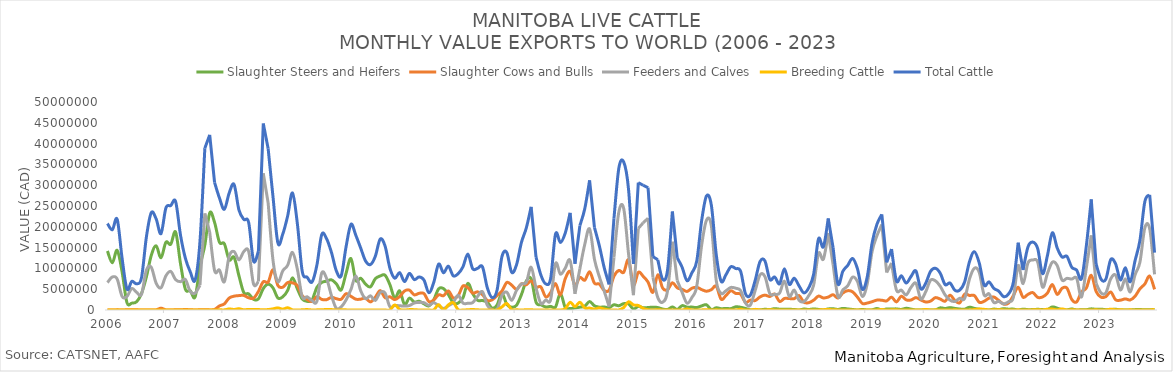
| Category | Slaughter Steers and Heifers | Slaughter Cows and Bulls | Feeders and Calves | Breeding Cattle | Total Cattle |
|---|---|---|---|---|---|
| 2006-01-01 | 14187904 | 5833 | 6591304 | 0 | 20785041 |
| 2006-02-01 | 11341319 | 11648 | 7928039 | 0 | 19281006 |
| 2006-03-01 | 14344812 | 31243 | 7440593 | 0 | 21816648 |
| 2006-04-01 | 9232013 | 18080 | 3279165 | 0 | 12529258 |
| 2006-05-01 | 1794050 | 38548 | 3237103 | 0 | 5069701 |
| 2006-06-01 | 1648332 | 71812 | 5171620 | 0 | 6891764 |
| 2006-07-01 | 1991443 | 43364 | 4253852 | 0 | 6288659 |
| 2006-08-01 | 3992152 | 0 | 3785370 | 0 | 7777522 |
| 2006-09-01 | 7959820 | 21344 | 9592922 | 0 | 17574086 |
| 2006-10-01 | 13127632 | 16458 | 10259279 | 0 | 23403369 |
| 2006-11-01 | 15422609 | 24030 | 6454480 | 0 | 21901119 |
| 2006-12-01 | 12555837 | 442847 | 5345739 | 0 | 18344423 |
| 2007-01-01 | 16281706 | 15391 | 8211393 | 0 | 24508490 |
| 2007-02-01 | 15818791 | 14749 | 9272261 | 0 | 25105801 |
| 2007-03-01 | 18738153 | 39614 | 7294564 | 0 | 26072331 |
| 2007-04-01 | 11161152 | 54176 | 6803755 | 0 | 18019083 |
| 2007-05-01 | 4994892 | 113471 | 7341133 | 0 | 12449496 |
| 2007-06-01 | 4651928 | 60521 | 4475342 | 0 | 9187791 |
| 2007-07-01 | 3135763 | 14576 | 4052472 | 0 | 7202811 |
| 2007-08-01 | 10463968 | 46770 | 5958488 | 0 | 16469226 |
| 2007-09-01 | 15598744 | 89978 | 23212124 | 0 | 38900846 |
| 2007-10-01 | 23343316 | 28135 | 18720277 | 0 | 42091728 |
| 2007-11-01 | 21040201 | 130356 | 9483319 | 0 | 30653876 |
| 2007-12-01 | 16280273 | 985290 | 9595732 | 46023 | 26907318 |
| 2008-01-01 | 15932224 | 1470525 | 6777698 | 33445 | 24213892 |
| 2008-02-01 | 12060461 | 2881618 | 12940348 | 249206 | 28131633 |
| 2008-03-01 | 12678058 | 3323484 | 14044679 | 132714 | 30178935 |
| 2008-04-01 | 8239235 | 3462530 | 12052325 | 294857 | 24048947 |
| 2008-05-01 | 4186915 | 3501724 | 14048994 | 56269 | 21793902 |
| 2008-06-01 | 3886678 | 2929304 | 14069918 | 140988 | 21026888 |
| 2008-07-01 | 2559955 | 2826612 | 6241963 | 124155 | 11752685 |
| 2008-08-01 | 2687825 | 4470797 | 6869086 | 107911 | 14135619 |
| 2008-09-01 | 5149888 | 6795923 | 32851550 | 35083 | 44832444 |
| 2008-10-01 | 6213290 | 6713226 | 25743866 | 109326 | 38779708 |
| 2008-11-01 | 5310735 | 9673176 | 11897774 | 276900 | 27158585 |
| 2008-12-01 | 2876273 | 5896305 | 6812893 | 511510 | 16096981 |
| 2009-01-01 | 3164992 | 5475904 | 9411820 | 197925 | 18250641 |
| 2009-02-01 | 4694803 | 6600046 | 10746835 | 539772 | 22581456 |
| 2009-03-01 | 7731548 | 6522191 | 13842401 | 38125 | 28134265 |
| 2009-04-01 | 5067954 | 5867918 | 9776770 | 7915 | 20720557 |
| 2009-05-01 | 2644755 | 3434314 | 3144349 | 39892 | 9263310 |
| 2009-06-01 | 2083407 | 2512518 | 3179141 | 103917 | 7878983 |
| 2009-07-01 | 2386515 | 2044848 | 2276924 | 12557 | 6720844 |
| 2009-08-01 | 5429442 | 3207333 | 2073322 | 30633 | 10740730 |
| 2009-09-01 | 6627423 | 2552131 | 8898741 | 49341 | 18127636 |
| 2009-10-01 | 6922475 | 2485088 | 7579433 | 132796 | 17119792 |
| 2009-11-01 | 7250504 | 3047411 | 3431969 | 103129 | 13833013 |
| 2009-12-01 | 6298529 | 2716718 | 382006 | 7381 | 9404634 |
| 2010-01-01 | 4826857 | 2593859 | 779081 | 38246 | 8238043 |
| 2010-02-01 | 8830912 | 3926017 | 2431916 | 31465 | 15220310 |
| 2010-03-01 | 12368940 | 3287651 | 4940770 | 0 | 20597361 |
| 2010-04-01 | 7136323 | 2597240 | 8208898 | 13126 | 17955587 |
| 2010-05-01 | 7642450 | 2604035 | 4638542 | 10378 | 14895405 |
| 2010-06-01 | 6217335 | 2841387 | 2723749 | 2617 | 11785088 |
| 2010-07-01 | 5570762 | 1947099 | 3411744 | 0 | 10929605 |
| 2010-08-01 | 7523630 | 3059142 | 2303454 | 15673 | 12901899 |
| 2010-09-01 | 8173951 | 4664316 | 4205856 | 0 | 17044123 |
| 2010-10-01 | 8362797 | 2953517 | 4070458 | 3105 | 15389877 |
| 2010-11-01 | 6072511 | 3170828 | 781666 | 5976 | 10030981 |
| 2010-12-01 | 2811809 | 2490822 | 1096604 | 1236783 | 7636018 |
| 2011-01-01 | 4595242 | 3237427 | 1016720 | 133404 | 8982793 |
| 2011-02-01 | 1309523 | 4564083 | 952847 | 0 | 6826453 |
| 2011-03-01 | 2858451 | 4776678 | 1069838 | 97480 | 8802447 |
| 2011-04-01 | 1903779 | 3639944 | 1678331 | 84601 | 7306655 |
| 2011-05-01 | 2100171 | 4017330 | 1824146 | 5960 | 7947607 |
| 2011-06-01 | 1481477 | 3942235 | 1758460 | 0 | 7182172 |
| 2011-07-01 | 990104 | 2019297 | 1126246 | 6824 | 4142471 |
| 2011-08-01 | 2458787 | 2395786 | 1750711 | 31743 | 6637027 |
| 2011-09-01 | 5074498 | 3652677 | 1010702 | 1291379 | 11029256 |
| 2011-10-01 | 5148920 | 3431319 | 363305 | 0 | 8943544 |
| 2011-11-01 | 3711327 | 4590631 | 1019521 | 1216890 | 10538369 |
| 2011-12-01 | 1724821 | 2917931 | 1799140 | 1776383 | 8218275 |
| 2012-01-01 | 1655396 | 3420608 | 3550341 | 100413 | 8726758 |
| 2012-02-01 | 2952434 | 5772904 | 1660142 | 0 | 10385480 |
| 2012-03-01 | 6396400 | 5362421 | 1617240 | 62267 | 13438328 |
| 2012-04-01 | 3951535 | 4066094 | 1778019 | 115435 | 9911083 |
| 2012-05-01 | 2329784 | 4366583 | 3270806 | 39966 | 10007139 |
| 2012-06-01 | 2279917 | 3708486 | 4391694 | 0 | 10380097 |
| 2012-07-01 | 1859692 | 2292790 | 1156590 | 12977 | 5322049 |
| 2012-08-01 | 452657 | 2448136 | 83976 | 0 | 2984769 |
| 2012-09-01 | 1199275 | 3510483 | 70703 | 0 | 4780461 |
| 2012-10-01 | 4024601 | 4559393 | 3492668 | 745031 | 12821693 |
| 2012-11-01 | 1348416 | 6617060 | 4276794 | 1565345 | 13807615 |
| 2012-12-01 | 671091 | 5982648 | 2322444 | 82150 | 9058333 |
| 2013-01-01 | 1142797 | 4984926 | 4715988 | 50413 | 10894124 |
| 2013-02-01 | 3689936 | 6295369 | 6248138 | 0 | 16233443 |
| 2013-03-01 | 6958552 | 6057976 | 6633666 | 58496 | 19708690 |
| 2013-04-01 | 7479647 | 6986678 | 10284914 | 47893 | 24799132 |
| 2013-05-01 | 1891004 | 5512602 | 5310753 | 0 | 12714359 |
| 2013-06-01 | 1252186 | 5537755 | 1586091 | 22679 | 8398711 |
| 2013-07-01 | 725313 | 3148345 | 2398543 | 0 | 6272201 |
| 2013-08-01 | 874553 | 4199016 | 2482637 | 0 | 7556206 |
| 2013-09-01 | 722089 | 6350757 | 11162610 | 17079 | 18252535 |
| 2013-10-01 | 3979542 | 3630921 | 8621963 | 0 | 16232426 |
| 2013-11-01 | 600510 | 7524782 | 10065407 | 308575 | 18499274 |
| 2013-12-01 | 357307 | 9279548 | 11866661 | 1856383 | 23359899 |
| 2014-01-01 | 493539 | 5942038 | 3877969 | 803830 | 11117376 |
| 2014-02-01 | 682186 | 7839484 | 9896218 | 1868299 | 20286187 |
| 2014-03-01 | 897650 | 7147617 | 15741401 | 509939 | 24296607 |
| 2014-04-01 | 2037349 | 9182224 | 19492498 | 458722 | 31170793 |
| 2014-05-01 | 1000433 | 6440127 | 12175424 | 202478 | 19818462 |
| 2014-06-01 | 687659 | 6234156 | 8006312 | 503563 | 15431690 |
| 2014-07-01 | 720700 | 4693005 | 4539293 | 223275 | 10176273 |
| 2014-08-01 | 578302 | 4746717 | 814266 | 15807 | 6155092 |
| 2014-09-01 | 1254646 | 8111051 | 12623783 | 19381 | 22008861 |
| 2014-10-01 | 1024771 | 9515586 | 23537454 | 0 | 34077811 |
| 2014-11-01 | 1525832 | 9064757 | 24390636 | 596426 | 35577651 |
| 2014-12-01 | 1470098 | 12042779 | 13432839 | 1988911 | 28934627 |
| 2015-01-01 | 236901 | 6038143 | 3551208 | 1228451 | 11054703 |
| 2015-02-01 | 873294 | 9037177 | 19613742 | 1091975 | 30616188 |
| 2015-03-01 | 523419 | 8098251 | 20964680 | 387984 | 29974334 |
| 2015-04-01 | 589216 | 6703437 | 22059439 | 65676 | 29417768 |
| 2015-05-01 | 685783 | 4260767 | 7875331 | 6645 | 12828526 |
| 2015-06-01 | 591428 | 8444089 | 2984759 | 67011 | 12087287 |
| 2015-07-01 | 226439 | 5275911 | 1879538 | 6980 | 7388868 |
| 2015-08-01 | 115084 | 4858880 | 4592052 | 17850 | 9583866 |
| 2015-09-01 | 730582 | 6538549 | 16412230 | 0 | 23681361 |
| 2015-10-01 | 132010 | 5320261 | 7055671 | 21473 | 12529415 |
| 2015-11-01 | 1048706 | 4967963 | 4246971 | 0 | 10263640 |
| 2015-12-01 | 690256 | 4466461 | 1647512 | 233904 | 7038133 |
| 2016-01-01 | 704410 | 5222057 | 2991201 | 13904 | 8931572 |
| 2016-02-01 | 588978 | 5461892 | 5696999 | 12692 | 11760561 |
| 2016-03-01 | 988503 | 4907803 | 15514149 | 25525 | 21435980 |
| 2016-04-01 | 1246707 | 4511591 | 21584608 | 78085 | 27420991 |
| 2016-05-01 | 102204 | 4882765 | 20178611 | 0 | 25163580 |
| 2016-06-01 | 536221 | 5716882 | 7080115 | 34948 | 13368166 |
| 2016-07-01 | 310954 | 2600981 | 4000587 | 0 | 6912522 |
| 2016-08-01 | 379947 | 3478365 | 4626684 | 14553 | 8499549 |
| 2016-09-01 | 334597 | 4619309 | 5422194 | 13830 | 10389930 |
| 2016-10-01 | 762969 | 3975548 | 5234474 | 0 | 9972991 |
| 2016-11-01 | 657444 | 3805498 | 4693416 | 175592 | 9331950 |
| 2016-12-01 | 371492 | 1841875 | 1690905 | 0 | 3904272 |
| 2017-01-01 | 32089 | 2371524 | 1167972 | 0 | 3571585 |
| 2017-02-01 | 4578 | 2265276 | 4711927 | 152285 | 7134066 |
| 2017-03-01 | 20184 | 3159520 | 8448852 | 29519 | 11658075 |
| 2017-04-01 | 176695 | 3579864 | 8034267 | 6158 | 11796984 |
| 2017-05-01 | 98106 | 3246415 | 3938173 | 66931 | 7349625 |
| 2017-06-01 | 322665 | 3820371 | 3784254 | 26115 | 7953405 |
| 2017-07-01 | 195129 | 2053773 | 4052502 | 0 | 6301404 |
| 2017-08-01 | 168303 | 2768911 | 6938554 | 25867 | 9901635 |
| 2017-09-01 | 165026 | 2750890 | 3223282 | 20942 | 6160140 |
| 2017-10-01 | 122629 | 2719424 | 4783194 | 20920 | 7646167 |
| 2017-11-01 | 0 | 3468692 | 2344667 | 0 | 5813359 |
| 2017-12-01 | 228123 | 1876977 | 2011972 | 0 | 4117072 |
| 2018-01-01 | 120815 | 1754497 | 3478608 | 3418 | 5357338 |
| 2018-02-01 | 254665 | 2362605 | 5974673 | 0 | 8591943 |
| 2018-03-01 | 139189 | 3350299 | 13613402 | 20821 | 17123711 |
| 2018-04-01 | 0 | 2889450 | 12226197 | 77020 | 15192667 |
| 2018-05-01 | 258334 | 3114671 | 18511150 | 127877 | 22012032 |
| 2018-06-01 | 303890 | 3669305 | 10899619 | 50517 | 14923331 |
| 2018-07-01 | 131117 | 2864661 | 3232824 | 26196 | 6254798 |
| 2018-08-01 | 387656 | 4087441 | 4824182 | 12297 | 9311576 |
| 2018-09-01 | 253491 | 4648894 | 5823313 | 0 | 10725698 |
| 2018-10-01 | 128357 | 4367623 | 7899262 | 0 | 12395242 |
| 2018-11-01 | 0 | 3079002 | 6830582 | 0 | 9909584 |
| 2018-12-01 | 126180 | 1578768 | 3258035 | 0 | 4962983 |
| 2019-01-01 | 0 | 1668919 | 6276109 | 0 | 7945028 |
| 2019-02-01 | 34857 | 1997599 | 14074725 | 0 | 16107181 |
| 2019-03-01 | 353914 | 2375723 | 17858675 | 25466 | 20613778 |
| 2019-04-01 | 0 | 2345831 | 20541126 | 104201 | 22991158 |
| 2019-05-01 | 255039 | 2195536 | 9010124 | 0 | 11460699 |
| 2019-06-01 | 246509 | 3088066 | 11273309 | 40725 | 14648609 |
| 2019-07-01 | 266277 | 1943733 | 4780863 | 35504 | 7026377 |
| 2019-08-01 | 135914 | 3315748 | 4777255 | 0 | 8228917 |
| 2019-09-01 | 413412 | 2435981 | 3630258 | 6090 | 6485741 |
| 2019-10-01 | 211489 | 2399486 | 5453301 | 0 | 8064276 |
| 2019-11-01 | 0 | 2977493 | 6402249 | 0 | 9379742 |
| 2019-12-01 | 0 | 2412519 | 2684816 | 0 | 5097335 |
| 2020-01-01 | 0 | 1937299 | 4351129 | 125703 | 6414131 |
| 2020-02-01 | 3170 | 2126023 | 7148714 | 0 | 9277907 |
| 2020-03-01 | 10914 | 2967669 | 7010772 | 37813 | 10027168 |
| 2020-04-01 | 513762 | 2621610 | 5681261 | 12723 | 8829356 |
| 2020-05-01 | 364226 | 2120934 | 3611634 | 0 | 6096794 |
| 2020-06-01 | 573968 | 3552029 | 2368110 | 0 | 6494107 |
| 2020-07-01 | 374854 | 2280702 | 2047658 | 40631 | 4743845 |
| 2020-08-01 | 235577 | 1725007 | 2830180 | 0 | 4790764 |
| 2020-09-01 | 173724 | 3803919 | 2761601 | 0 | 6739244 |
| 2020-10-01 | 674990 | 3491895 | 7461132 | 0 | 11628017 |
| 2020-11-01 | 389233 | 3470278 | 10037358 | 113708 | 14010577 |
| 2020-12-01 | 163115 | 1851749 | 9051813 | 239867 | 11306544 |
| 2021-01-01 | 116075 | 2088327 | 3638229 | 157961 | 6000592 |
| 2021-02-01 | 0 | 2849875 | 3912863 | 0 | 6762738 |
| 2021-03-01 | 217255 | 3122711 | 1793345 | 70477 | 5203788 |
| 2021-04-01 | 107304 | 2300189 | 2078459 | 58860 | 4544812 |
| 2021-05-01 | 301866 | 1431621 | 1450431 | 27184 | 3211102 |
| 2021-06-01 | 201209 | 1648874 | 1979175 | 17229 | 3846487 |
| 2021-07-01 | 213985 | 3445306 | 2986168 | 0 | 6645459 |
| 2021-08-01 | 5797 | 5463320 | 10681441 | 32390 | 16182948 |
| 2021-09-01 | 205942 | 3062402 | 6340071 | 0 | 9608415 |
| 2021-10-01 | 86098 | 3748226 | 11302462 | 0 | 15136786 |
| 2021-11-01 | 100441 | 4185550 | 12002077 | 32721 | 16320789 |
| 2021-12-01 | 162998 | 3039676 | 11502154 | 73288 | 14778116 |
| 2022-01-01 | 100335 | 3132944 | 5491788 | 24850 | 8749917 |
| 2022-02-01 | 72185 | 4065387 | 8759756 | 187103 | 13084431 |
| 2022-03-01 | 741973 | 6116630 | 11478177 | 214743 | 18551523 |
| 2022-04-01 | 445223 | 3755526 | 10699706 | 45014 | 14945469 |
| 2022-05-01 | 50958 | 5222313 | 7209942 | 262186 | 12745399 |
| 2022-06-01 | 16024 | 5276579 | 7608222 | 0 | 12900825 |
| 2022-07-01 | 243454 | 2532655 | 7427401 | 62436 | 10265946 |
| 2022-08-01 | 0 | 1956744 | 7624097 | 8076 | 9588917 |
| 2022-09-01 | 73361 | 4335340 | 3129080 | 0 | 7537781 |
| 2022-10-01 | 77172 | 5284970 | 10152759 | 0 | 15514901 |
| 2022-11-01 | 274017 | 8363149 | 17942425 | 12175 | 26591766 |
| 2022-12-01 | 156005 | 4457998 | 6393594 | 36893 | 11044490 |
| 2023-01-01 | 207524 | 3084589 | 4127095 | 0 | 7419208 |
| 2023-02-01 | 73221 | 3209416 | 4149085 | 0 | 7431722 |
| 2023-03-01 | 105724 | 4322333 | 7498428 | 196336 | 12122821 |
| 2023-04-01 | 178470 | 2460136 | 8380790 | 70081 | 11089477 |
| 2023-05-01 | 3955 | 2360504 | 4800628 | 60975 | 7226062 |
| 2023-06-01 | 6175 | 2672430 | 7475534 | 10896 | 10165035 |
| 2023-07-01 | 3145 | 2416314 | 4323072 | 35218 | 6777749 |
| 2023-08-01 | 92174 | 3314126 | 8462018 | 12339 | 11880657 |
| 2023-09-01 | 113570 | 5103447 | 11524517 | 29906 | 16771440 |
| 2023-10-01 | 41866 | 6253948 | 19729767 | 20784 | 26046365 |
| 2023-11-01 | 51590 | 8137455 | 19488395 | 13116 | 27690556 |
| 2023-12-01 | 144474 | 4954990 | 8574711 | 144187 | 13818362 |